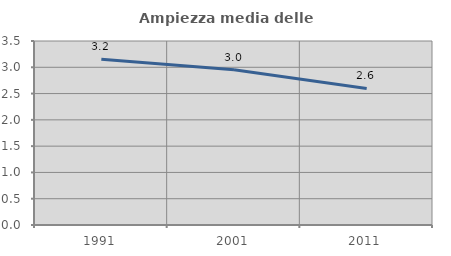
| Category | Ampiezza media delle famiglie |
|---|---|
| 1991.0 | 3.154 |
| 2001.0 | 2.952 |
| 2011.0 | 2.598 |